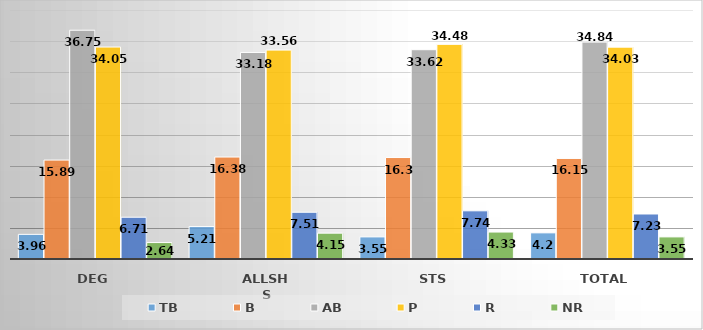
| Category | TB | B | AB | P | R | NR |
|---|---|---|---|---|---|---|
| DEG | 3.96 | 15.89 | 36.75 | 34.05 | 6.71 | 2.64 |
| ALLSHS | 5.21 | 16.38 | 33.18 | 33.56 | 7.51 | 4.15 |
| STS | 3.55 | 16.3 | 33.62 | 34.48 | 7.74 | 4.33 |
| Total | 4.2 | 16.15 | 34.84 | 34.03 | 7.23 | 3.55 |